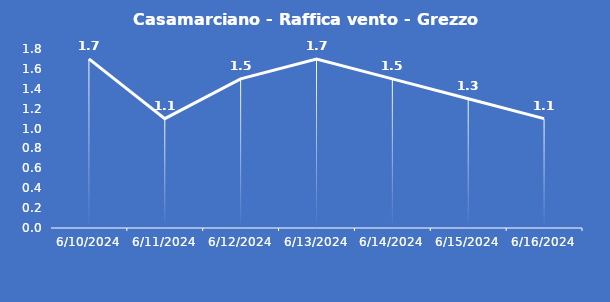
| Category | Casamarciano - Raffica vento - Grezzo (m/s) |
|---|---|
| 6/10/24 | 1.7 |
| 6/11/24 | 1.1 |
| 6/12/24 | 1.5 |
| 6/13/24 | 1.7 |
| 6/14/24 | 1.5 |
| 6/15/24 | 1.3 |
| 6/16/24 | 1.1 |